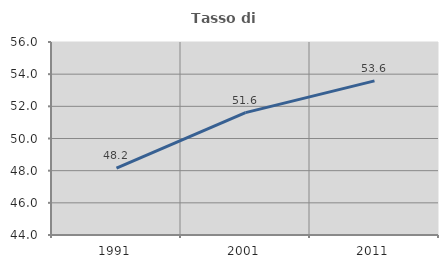
| Category | Tasso di occupazione   |
|---|---|
| 1991.0 | 48.162 |
| 2001.0 | 51.611 |
| 2011.0 | 53.583 |